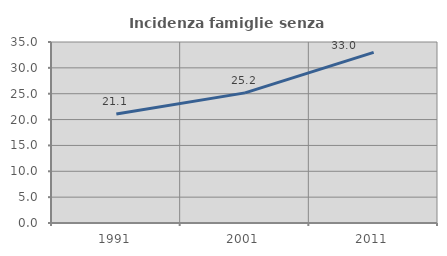
| Category | Incidenza famiglie senza nuclei |
|---|---|
| 1991.0 | 21.087 |
| 2001.0 | 25.161 |
| 2011.0 | 32.991 |